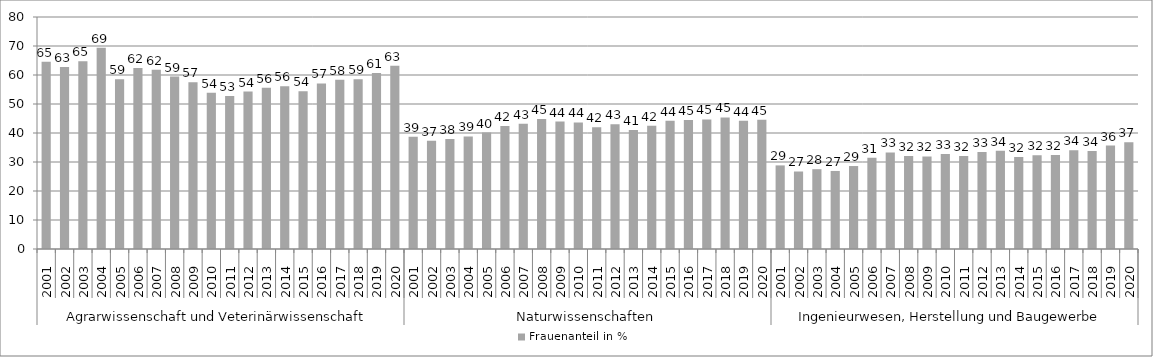
| Category | Frauenanteil in % |
|---|---|
| 0 | 64.539 |
| 1 | 62.762 |
| 2 | 64.7 |
| 3 | 69.389 |
| 4 | 58.553 |
| 5 | 62.423 |
| 6 | 61.805 |
| 7 | 59.453 |
| 8 | 57.488 |
| 9 | 53.858 |
| 10 | 52.726 |
| 11 | 54.303 |
| 12 | 55.579 |
| 13 | 56.106 |
| 14 | 54.426 |
| 15 | 57.084 |
| 16 | 58.343 |
| 17 | 58.568 |
| 18 | 60.669 |
| 19 | 63.206 |
| 20 | 38.699 |
| 21 | 37.293 |
| 22 | 37.894 |
| 23 | 38.816 |
| 24 | 40.164 |
| 25 | 42.416 |
| 26 | 43.208 |
| 27 | 44.868 |
| 28 | 43.929 |
| 29 | 43.642 |
| 30 | 42.005 |
| 31 | 43.036 |
| 32 | 41.022 |
| 33 | 42.459 |
| 34 | 44.214 |
| 35 | 44.515 |
| 36 | 44.674 |
| 37 | 45.365 |
| 38 | 44.223 |
| 39 | 44.566 |
| 40 | 28.827 |
| 41 | 26.725 |
| 42 | 27.521 |
| 43 | 26.912 |
| 44 | 28.611 |
| 45 | 31.462 |
| 46 | 33.307 |
| 47 | 32.111 |
| 48 | 31.931 |
| 49 | 32.785 |
| 50 | 32.102 |
| 51 | 33.481 |
| 52 | 33.899 |
| 53 | 31.72 |
| 54 | 32.346 |
| 55 | 32.406 |
| 56 | 34.093 |
| 57 | 33.777 |
| 58 | 35.679 |
| 59 | 36.785 |